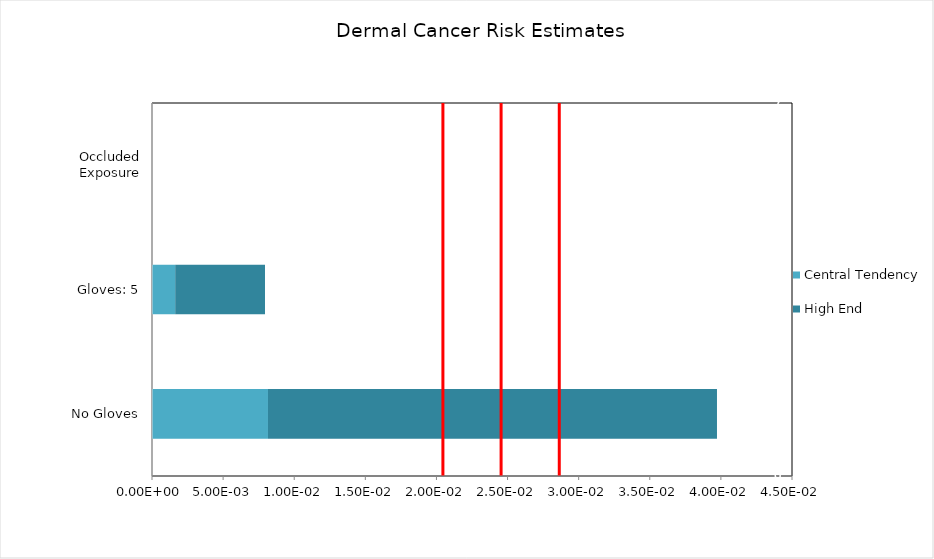
| Category | Central Tendency | High End |
|---|---|---|
| No Gloves | 0.008 | 0.032 |
| Gloves: 5 | 0.002 | 0.006 |
| Occluded Exposure | 0 | 0 |